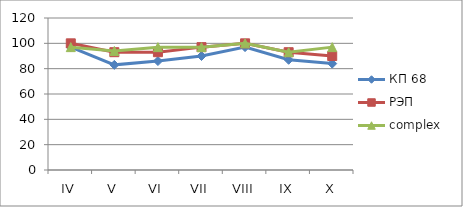
| Category | КП 68 | РЭП  | complex |
|---|---|---|---|
| IV | 97 | 100 | 97 |
| V | 83 | 93 | 94 |
| VI | 86 | 93 | 97 |
| VII | 90 | 97 | 97 |
| VIII | 97 | 100 | 100 |
| IX | 87 | 93 | 93 |
| X | 84 | 90 | 97 |